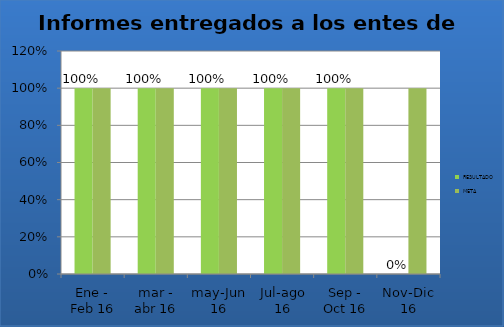
| Category | RESULTADO | META |
|---|---|---|
| Ene - Feb 16 | 1 | 1 |
| mar - abr 16 | 1 | 1 |
| may-Jun 16 | 1 | 1 |
| Jul-ago 16 | 1 | 1 |
| Sep - Oct 16 | 1 | 1 |
| Nov-Dic 16 | 0 | 1 |